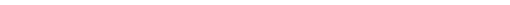
| Category | Series 0 |
|---|---|
| Space Heating | 3.418 |
| Space Cooling | 0 |